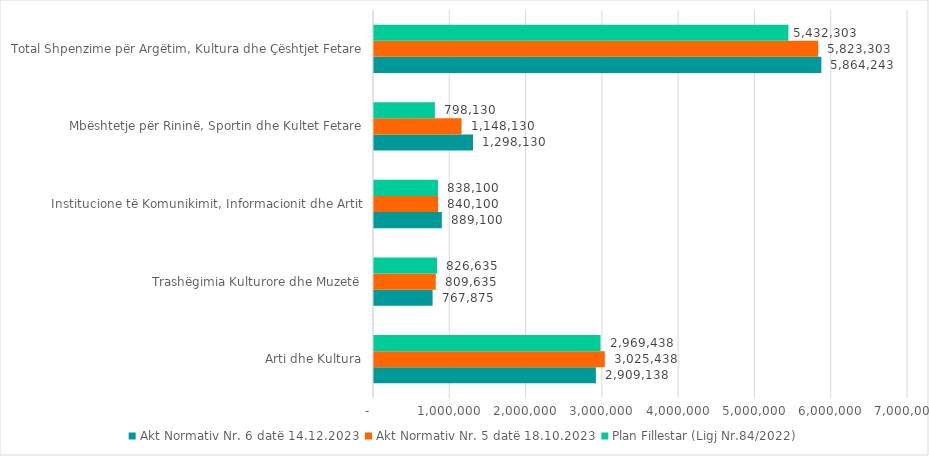
| Category | Akt Normativ Nr. 6 datë 14.12.2023 | Akt Normativ Nr. 5 datë 18.10.2023 | Plan Fillestar (Ligj Nr.84/2022) |
|---|---|---|---|
| Arti dhe Kultura | 2909138 | 3025438 | 2969438 |
| Trashëgimia Kulturore dhe Muzetë | 767875 | 809635 | 826635 |
| Institucione të Komunikimit, Informacionit dhe Artit | 889100 | 840100 | 838100 |
| Mbështetje për Rininë, Sportin dhe Kultet Fetare | 1298130 | 1148130 | 798130 |
| Total Shpenzime për Argëtim, Kultura dhe Çështjet Fetare | 5864243 | 5823303 | 5432303 |